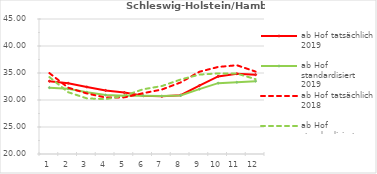
| Category | ab Hof tatsächlich 2019 | ab Hof standardisiert 2019 | ab Hof tatsächlich 2018 | ab Hof standardisiert 2018 |
|---|---|---|---|---|
| 0 | 33.485 | 32.284 | 34.983 | 34.25 |
| 1 | 33.11 | 32.062 | 32.29 | 31.447 |
| 2 | 32.412 | 31.45 | 31.207 | 30.299 |
| 3 | 31.772 | 30.917 | 30.466 | 30.162 |
| 4 | 31.374 | 30.797 | 30.486 | 30.793 |
| 5 | 30.782 | 30.787 | 31.26 | 31.984 |
| 6 | 30.672 | 30.731 | 31.94 | 32.586 |
| 7 | 30.885 | 30.848 | 33.255 | 33.793 |
| 8 | 32.665 | 32.008 | 35.226 | 34.7 |
| 9 | 34.373 | 33.117 | 36.118 | 34.929 |
| 10 | 34.859 | 33.285 | 36.437 | 34.896 |
| 11 | 34.692 | 33.488 | 35.258 | 33.855 |